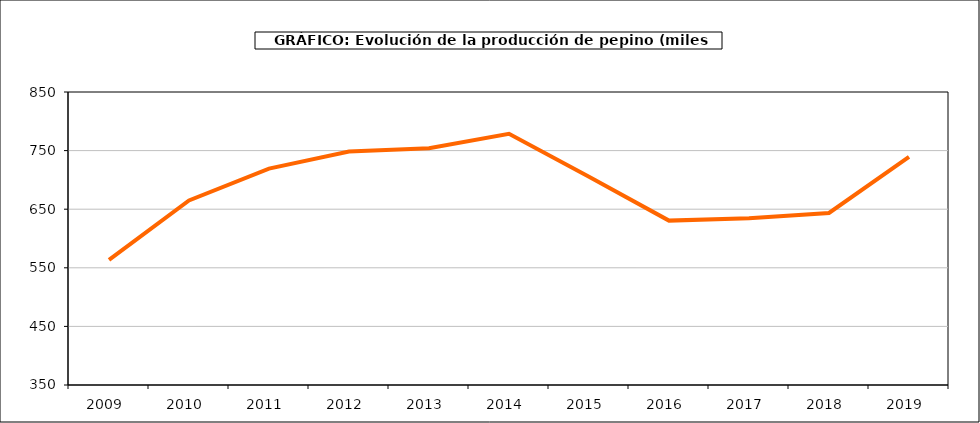
| Category | producción |
|---|---|
| 2009.0 | 563.566 |
| 2010.0 | 664.975 |
| 2011.0 | 719.219 |
| 2012.0 | 748.5 |
| 2013.0 | 753.941 |
| 2014.0 | 778.571 |
| 2015.0 | 705.223 |
| 2016.0 | 630.525 |
| 2017.0 | 634.43 |
| 2018.0 | 643.621 |
| 2019.0 | 739.165 |